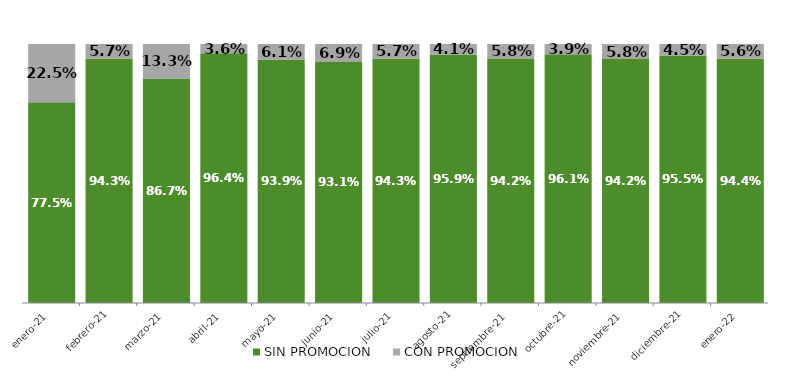
| Category | SIN PROMOCION   | CON PROMOCION   |
|---|---|---|
| 2021-01-01 | 0.775 | 0.225 |
| 2021-02-01 | 0.943 | 0.057 |
| 2021-03-01 | 0.867 | 0.133 |
| 2021-04-01 | 0.964 | 0.036 |
| 2021-05-01 | 0.939 | 0.061 |
| 2021-06-01 | 0.931 | 0.069 |
| 2021-07-01 | 0.943 | 0.057 |
| 2021-08-01 | 0.959 | 0.041 |
| 2021-09-01 | 0.942 | 0.058 |
| 2021-10-01 | 0.961 | 0.039 |
| 2021-11-01 | 0.942 | 0.058 |
| 2021-12-01 | 0.955 | 0.045 |
| 2022-01-01 | 0.944 | 0.056 |